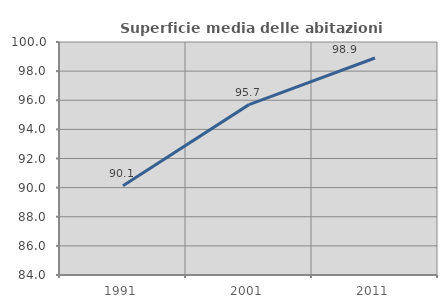
| Category | Superficie media delle abitazioni occupate |
|---|---|
| 1991.0 | 90.124 |
| 2001.0 | 95.699 |
| 2011.0 | 98.902 |